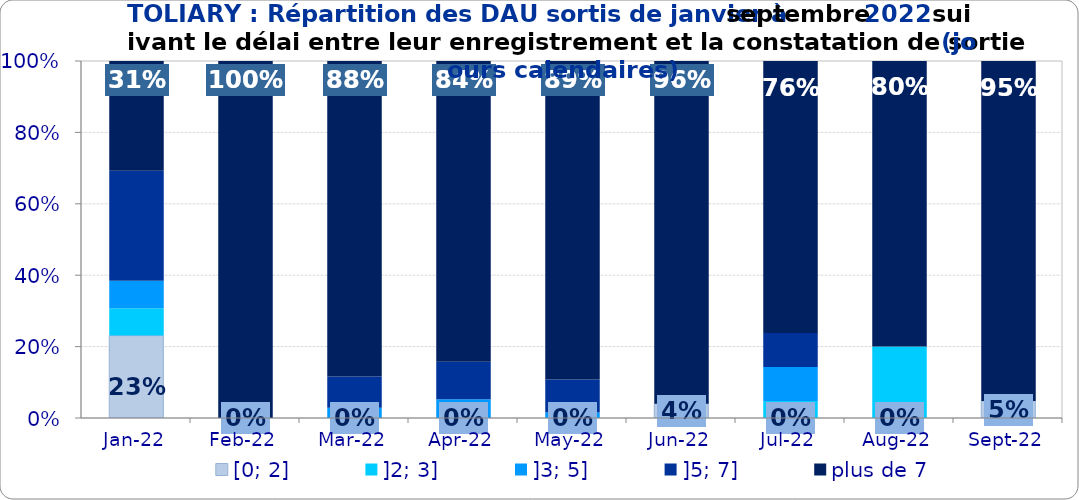
| Category | [0; 2] | ]2; 3] | ]3; 5] | ]5; 7] | plus de 7 |
|---|---|---|---|---|---|
| 2022-01-01 | 0.231 | 0.077 | 0.077 | 0.308 | 0.308 |
| 2022-02-01 | 0 | 0 | 0 | 0 | 1 |
| 2022-03-01 | 0 | 0 | 0.029 | 0.087 | 0.884 |
| 2022-04-01 | 0 | 0 | 0.053 | 0.105 | 0.842 |
| 2022-05-01 | 0 | 0 | 0.015 | 0.092 | 0.892 |
| 2022-06-01 | 0.04 | 0 | 0 | 0 | 0.96 |
| 2022-07-01 | 0 | 0.048 | 0.095 | 0.095 | 0.762 |
| 2022-08-01 | 0 | 0.2 | 0 | 0 | 0.8 |
| 2022-09-01 | 0.048 | 0 | 0 | 0 | 0.952 |